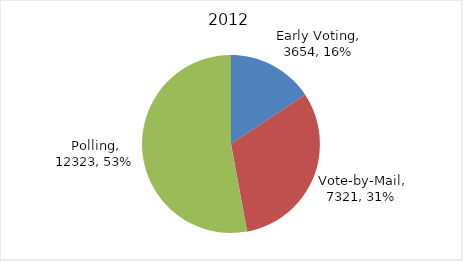
| Category | Series 0 |
|---|---|
| Early Voting | 3654 |
| Vote-by-Mail | 7321 |
| Polling | 12323 |